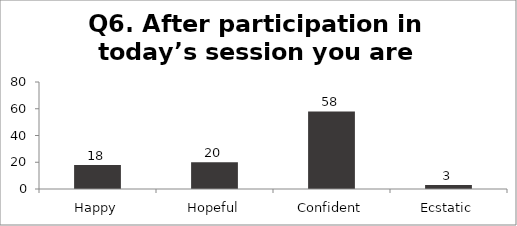
| Category | Q6. After participation in today’s session you are feeling? |
|---|---|
| Happy | 18 |
| Hopeful | 20 |
| Confident | 58 |
| Ecstatic | 3 |